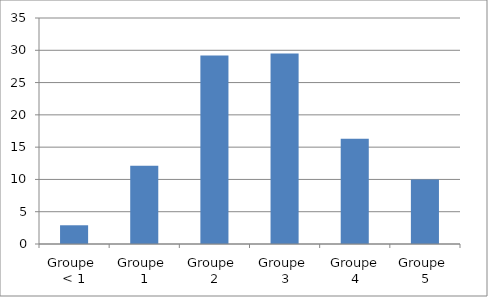
| Category | 2015 |
|---|---|
| Groupe 
< 1 | 2.9 |
| Groupe 
1 | 12.1 |
| Groupe 
2 | 29.2 |
| Groupe 
3 | 29.5 |
| Groupe
4 | 16.3 |
| Groupe 
5 | 10 |